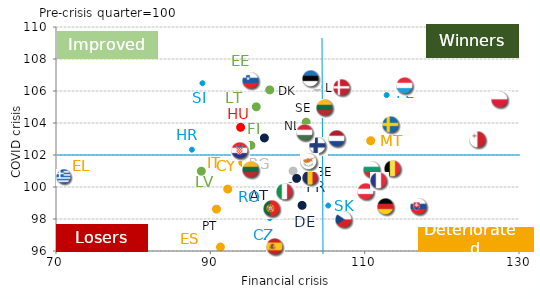
| Category | Series 0 |
|---|---|
| 102.4682767089644 | 101.067 |
| 100.7222605099931 | 101 |
| 97.70818104022534 | 98.063 |
| 97.69980846771162 | 106.069 |
| 101.89432409342007 | 98.853 |
| 94.87035712214082 | 106.681 |
| 70.75219232415103 | 100.657 |
| 91.30845905555476 | 96.247 |
| 101.18415315614473 | 100.538 |
| 87.60827757203936 | 102.333 |
| 92.25000233885197 | 99.87 |
| 94.20506723515906 | 101.531 |
| 88.83508663366338 | 100.987 |
| 95.95187450146238 | 105.011 |
| 103.85205497339471 | 106.25 |
| 93.92286858780543 | 103.73 |
| 110.78271282386238 | 102.892 |
| 97.00772065192456 | 103.065 |
| 100.36240801578043 | 100.012 |
| 112.85139504031491 | 105.746 |
| 90.79598075563305 | 98.618 |
| 94.58039724809628 | 100.828 |
| 88.97768542075313 | 106.486 |
| 105.28241508048933 | 98.841 |
| 95.25839584120303 | 102.604 |
| 102.41972563632744 | 104.052 |